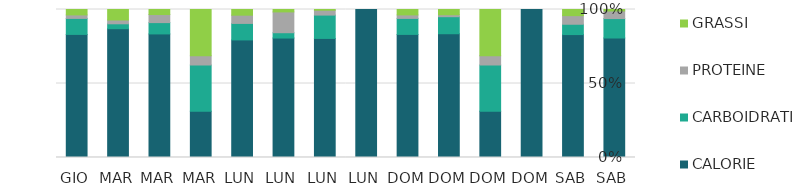
| Category | CALORIE | CARBOIDRATI | PROTEINE | GRASSI |
|---|---|---|---|---|
| SAB | 283 | 46 | 18 | 3.5 |
| SAB | 500 | 42 | 35 | 25 |
| DOM | 1 | 0 | 0 | 0 |
| DOM | 10 | 10 | 2 | 10 |
| DOM | 189 | 26 | 3 | 8 |
| DOM | 477 | 62 | 13.5 | 21 |
| LUN | 1 | 0 | 0 | 0 |
| LUN | 245 | 48 | 10 | 1.5 |
| LUN | 247 | 11 | 43 | 5 |
| LUN | 456 | 64 | 32 | 22 |
| MAR | 10 | 10 | 2 | 10 |
| MAR | 135 | 12.36 | 8.81 | 5.51 |
| MAR | 184 | 7 | 5.43 | 15 |
| GIO | 477 | 62 | 13.5 | 21 |